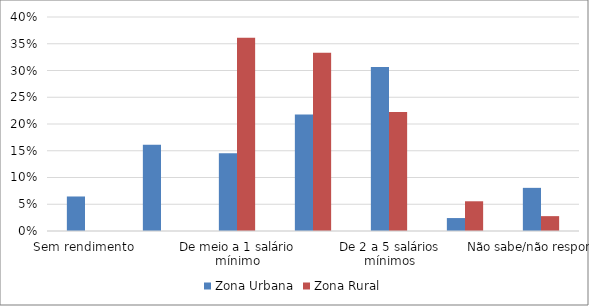
| Category | Zona Urbana | Zona Rural |
|---|---|---|
| Sem rendimento | 0.065 | 0 |
| Até meio salário mínimo | 0.161 | 0 |
| De meio a 1 salário mínimo | 0.145 | 0.361 |
| De 1 a 2 salários mínimos | 0.218 | 0.333 |
| De 2 a 5 salários mínimos | 0.306 | 0.222 |
| De 5 a 10 salários mínimos | 0.024 | 0.056 |
| Não sabe/não respondeu | 0.081 | 0.028 |